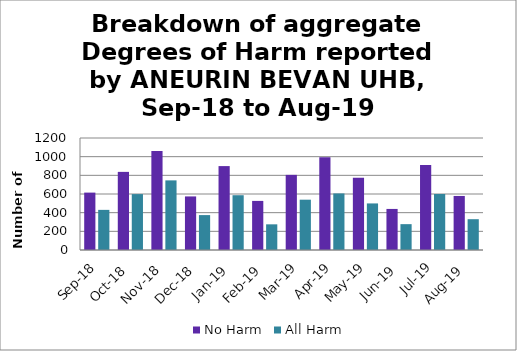
| Category | No Harm | All Harm |
|---|---|---|
| Sep-18 | 615 | 430 |
| Oct-18 | 837 | 599 |
| Nov-18 | 1062 | 746 |
| Dec-18 | 574 | 374 |
| Jan-19 | 899 | 587 |
| Feb-19 | 526 | 275 |
| Mar-19 | 805 | 539 |
| Apr-19 | 994 | 606 |
| May-19 | 773 | 499 |
| Jun-19 | 440 | 277 |
| Jul-19 | 912 | 600 |
| Aug-19 | 579 | 330 |